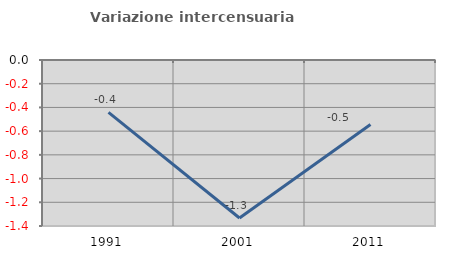
| Category | Variazione intercensuaria annua |
|---|---|
| 1991.0 | -0.442 |
| 2001.0 | -1.333 |
| 2011.0 | -0.544 |